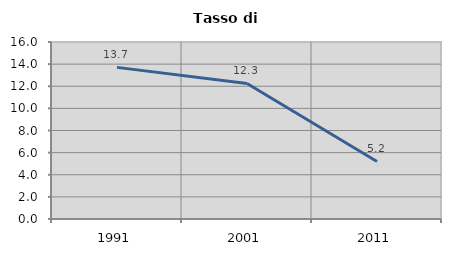
| Category | Tasso di disoccupazione   |
|---|---|
| 1991.0 | 13.706 |
| 2001.0 | 12.255 |
| 2011.0 | 5.2 |